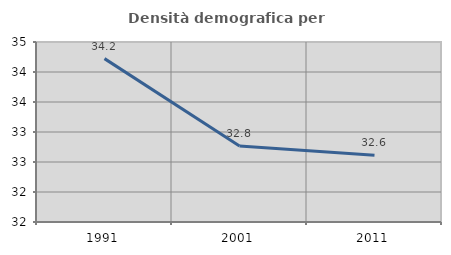
| Category | Densità demografica |
|---|---|
| 1991.0 | 34.223 |
| 2001.0 | 32.768 |
| 2011.0 | 32.613 |